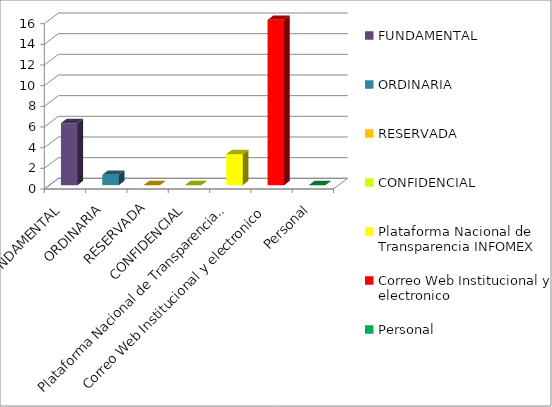
| Category | Series 2 |
|---|---|
| FUNDAMENTAL | 6 |
| ORDINARIA | 1 |
| RESERVADA | 0 |
| CONFIDENCIAL | 0 |
| Plataforma Nacional de Transparencia INFOMEX | 3 |
| Correo Web Institucional y electronico | 16 |
| Personal | 0 |